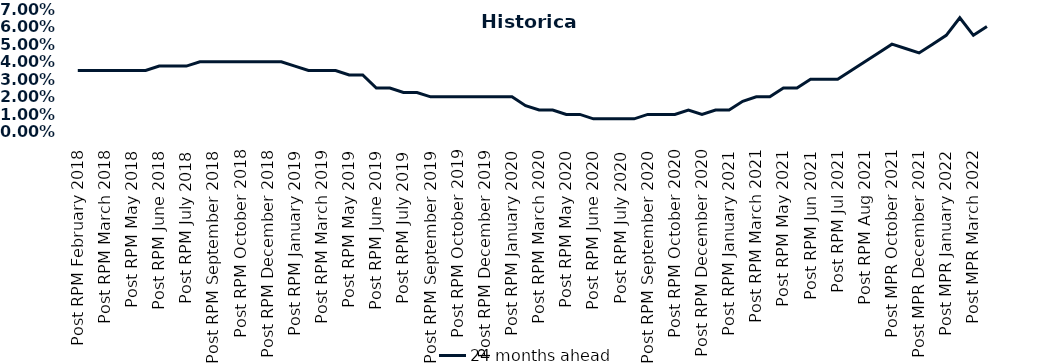
| Category | 24 months ahead |
|---|---|
| Post RPM February 2018 | 0.035 |
| Pre RPM March 2018 | 0.035 |
| Post RPM March 2018 | 0.035 |
| Pre RPM May 2018 | 0.035 |
| Post RPM May 2018 | 0.035 |
| Pre RPM June 2018 | 0.035 |
| Post RPM June 2018 | 0.038 |
| Pre RPM July 2018 | 0.038 |
| Post RPM July 2018 | 0.038 |
| Pre RPM September 2018 | 0.04 |
| Post RPM September 2018 | 0.04 |
| Pre RPM October 2018 | 0.04 |
| Post RPM October 2018 | 0.04 |
| Pre RPM December 2018 | 0.04 |
| Post RPM December 2018 | 0.04 |
| Pre RPM January 2019 | 0.04 |
| Post RPM January 2019 | 0.038 |
| Pre RPM March 2019 | 0.035 |
| Post RPM March 2019 | 0.035 |
| Pre RPM May 2019 | 0.035 |
| Post RPM May 2019 | 0.032 |
| Pre RPM June 2019 | 0.032 |
| Post RPM June 2019 | 0.025 |
| Pre RPM July 2019 | 0.025 |
| Post RPM July 2019 | 0.022 |
| Pre RPM September 2019 | 0.022 |
| Post RPM September 2019 | 0.02 |
| Pre RPM October 2019 | 0.02 |
| Post RPM October 2019 | 0.02 |
| Pre RPM December 2019 | 0.02 |
| Post RPM December 2019 | 0.02 |
| Pre RPM January 2020 | 0.02 |
| Post RPM January 2020 | 0.02 |
| Pre RPM March 2020 | 0.015 |
| Post RPM March 2020 | 0.012 |
| Pre RPM May 2020 | 0.012 |
| Post RPM May 2020 | 0.01 |
| Pre RPM June 2020 | 0.01 |
| Post RPM June 2020 | 0.008 |
| Pre RPM July 2020 | 0.008 |
| Post RPM July 2020 | 0.008 |
| Pre RPM September 2020 | 0.008 |
| Post RPM September 2020 | 0.01 |
| Pre RPM October 2020 | 0.01 |
| Post RPM October 2020 | 0.01 |
| Pre RPM December 2020 | 0.012 |
|  Post RPM December 2020 | 0.01 |
| Pre RPM January 2021 | 0.012 |
| Post RPM January 2021 | 0.012 |
|  Pre RPM March 2021 | 0.018 |
|  Post RPM March 2021 | 0.02 |
|  Pre RPM May 2021 | 0.02 |
|  Post RPM May 2021 | 0.025 |
|  Pre RPM Jun 2021 | 0.025 |
|   Post RPM Jun 2021 | 0.03 |
| Pre RPM Jul 2021 | 0.03 |
|  Post RPM Jul 2021 | 0.03 |
| Pre RPM Aug 2021 | 0.035 |
|  Post RPM Aug 2021 | 0.04 |
| Pre MPR October 2021 | 0.045 |
| Post MPR October 2021 | 0.05 |
| Pre MPR December 2021 | 0.048 |
| Post MPR December 2021 | 0.045 |
| Pre MPR January 2022 | 0.05 |
| Post MPR January 2022 | 0.055 |
| Pre MPR March 2022 | 0.065 |
| Post MPR March 2022 | 0.055 |
| Pre MPR May 2022 | 0.06 |